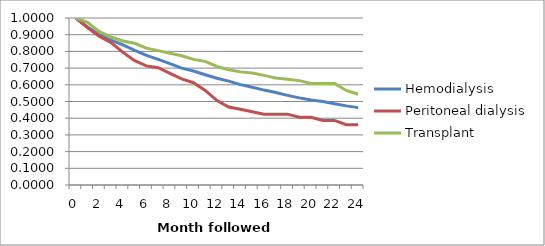
| Category | Hemodialysis | Peritoneal dialysis | Transplant |
|---|---|---|---|
| 0.0 | 1 | 1 | 1 |
| 1.0 | 0.946 | 0.941 | 0.975 |
| 2.0 | 0.899 | 0.89 | 0.918 |
| 3.0 | 0.867 | 0.853 | 0.886 |
| 4.0 | 0.839 | 0.795 | 0.863 |
| 5.0 | 0.806 | 0.744 | 0.848 |
| 6.0 | 0.777 | 0.713 | 0.819 |
| 7.0 | 0.752 | 0.702 | 0.804 |
| 8.0 | 0.727 | 0.669 | 0.789 |
| 9.0 | 0.7 | 0.635 | 0.774 |
| 10.0 | 0.682 | 0.613 | 0.752 |
| 11.0 | 0.66 | 0.566 | 0.74 |
| 12.0 | 0.639 | 0.506 | 0.71 |
| 13.0 | 0.622 | 0.467 | 0.69 |
| 14.0 | 0.601 | 0.453 | 0.677 |
| 15.0 | 0.585 | 0.439 | 0.67 |
| 16.0 | 0.568 | 0.424 | 0.656 |
| 17.0 | 0.554 | 0.424 | 0.641 |
| 18.0 | 0.537 | 0.424 | 0.633 |
| 19.0 | 0.522 | 0.406 | 0.625 |
| 20.0 | 0.509 | 0.406 | 0.608 |
| 21.0 | 0.5 | 0.387 | 0.608 |
| 22.0 | 0.486 | 0.387 | 0.608 |
| 23.0 | 0.474 | 0.361 | 0.566 |
| 24.0 | 0.463 | 0.361 | 0.543 |